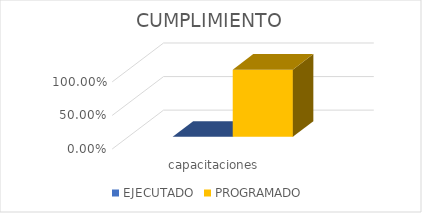
| Category | EJECUTADO | PROGRAMADO |
|---|---|---|
| capacitaciones  | 0 | 1 |